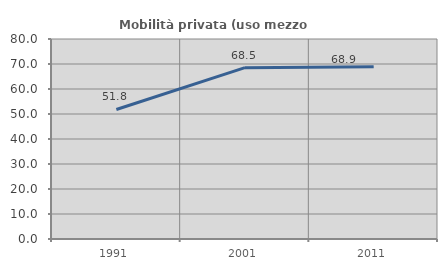
| Category | Mobilità privata (uso mezzo privato) |
|---|---|
| 1991.0 | 51.815 |
| 2001.0 | 68.543 |
| 2011.0 | 68.927 |